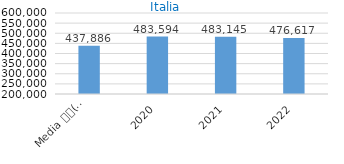
| Category | Series 0 |
|---|---|
| Media 
(2015-2019) | 437886.2 |
| 2020 | 483594 |
| 2021 | 483145 |
| 2022 | 476616.8 |